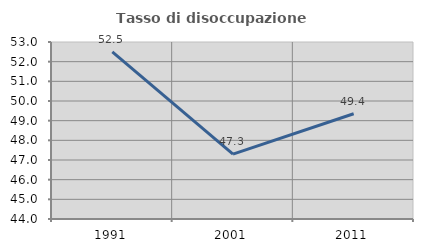
| Category | Tasso di disoccupazione giovanile  |
|---|---|
| 1991.0 | 52.5 |
| 2001.0 | 47.297 |
| 2011.0 | 49.351 |